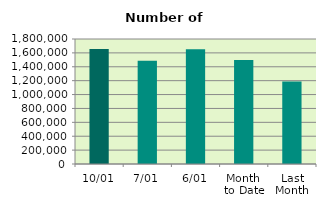
| Category | Series 0 |
|---|---|
| 10/01 | 1657410 |
| 7/01 | 1485610 |
| 6/01 | 1653494 |
| Month 
to Date | 1496620 |
| Last
Month | 1187425.652 |